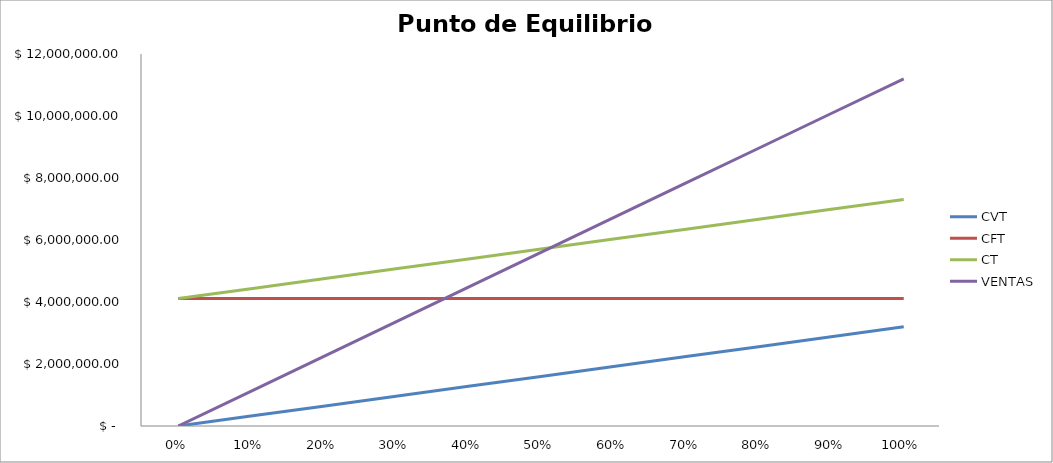
| Category | CVT | CFT | CT | VENTAS |
|---|---|---|---|---|
| 0.0 | 0 | 4110765.233 | 4110765.233 | 0 |
| 0.1 | 319826.549 | 4110765.233 | 4430591.783 | 1120000 |
| 0.2 | 639653.099 | 4110765.233 | 4750418.332 | 2240000 |
| 0.3 | 959479.648 | 4110765.233 | 5070244.882 | 3360000 |
| 0.4 | 1279306.198 | 4110765.233 | 5390071.431 | 4480000 |
| 0.5 | 1599132.747 | 4110765.233 | 5709897.981 | 5600000 |
| 0.6 | 1918959.297 | 4110765.233 | 6029724.53 | 6720000 |
| 0.7 | 2238785.846 | 4110765.233 | 6349551.08 | 7840000 |
| 0.8 | 2558612.396 | 4110765.233 | 6669377.629 | 8960000 |
| 0.9 | 2878438.945 | 4110765.233 | 6989204.179 | 10080000 |
| 1.0 | 3198265.495 | 4110765.233 | 7309030.728 | 11200000 |